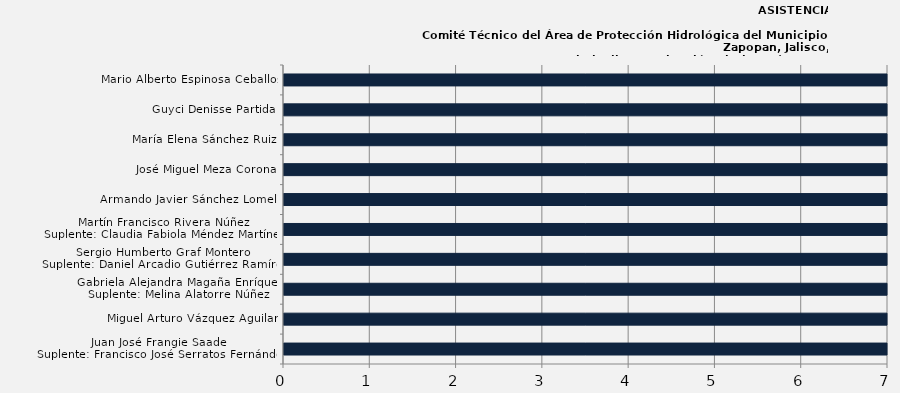
| Category | Juan José Frangie Saade
Suplente: Francisco José Serratos Fernández |
|---|---|
| Juan José Frangie Saade
Suplente: Francisco José Serratos Fernández | 100 |
| Miguel Arturo Vázquez Aguilar  | 100 |
| Gabriela Alejandra Magaña Enríquez
Suplente: Melina Alatorre Núñez | 100 |
| Sergio Humberto Graf Montero
Suplente: Daniel Arcadio Gutiérrez Ramírez | 100 |
| Martín Francisco Rivera Núñez
Suplente: Claudia Fabiola Méndez Martínez | 100 |
| Armando Javier Sánchez Lomelí  | 66.667 |
| José Miguel Meza Corona  | 66.667 |
| María Elena Sánchez Ruiz  | 66.667 |
| Guyci Denisse Partida  | 66.667 |
| Mario Alberto Espinosa Ceballos | 100 |